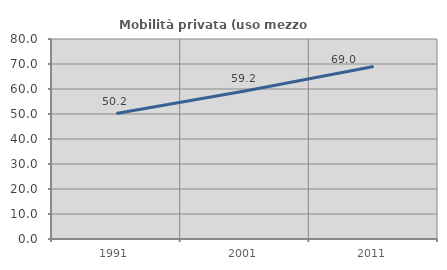
| Category | Mobilità privata (uso mezzo privato) |
|---|---|
| 1991.0 | 50.191 |
| 2001.0 | 59.226 |
| 2011.0 | 69.016 |